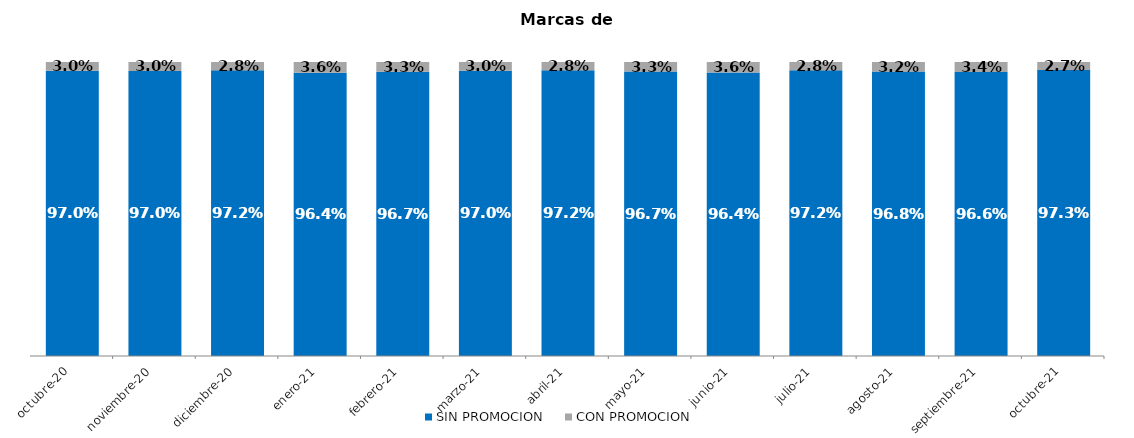
| Category | SIN PROMOCION   | CON PROMOCION   |
|---|---|---|
| 2020-10-01 | 0.97 | 0.03 |
| 2020-11-01 | 0.97 | 0.03 |
| 2020-12-01 | 0.972 | 0.028 |
| 2021-01-01 | 0.964 | 0.036 |
| 2021-02-01 | 0.967 | 0.033 |
| 2021-03-01 | 0.97 | 0.03 |
| 2021-04-01 | 0.972 | 0.028 |
| 2021-05-01 | 0.967 | 0.033 |
| 2021-06-01 | 0.964 | 0.036 |
| 2021-07-01 | 0.972 | 0.028 |
| 2021-08-01 | 0.968 | 0.032 |
| 2021-09-01 | 0.966 | 0.034 |
| 2021-10-01 | 0.973 | 0.027 |